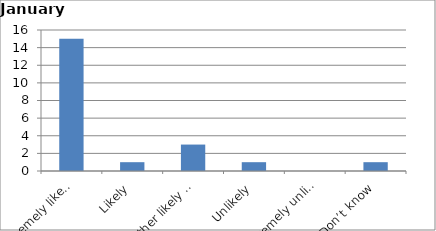
| Category | Series 0 |
|---|---|
| Extremely likely | 15 |
| Likely | 1 |
| Neither likely nor unlikely | 3 |
| Unlikely | 1 |
| Extremely unlikely | 0 |
| Don’t know | 1 |